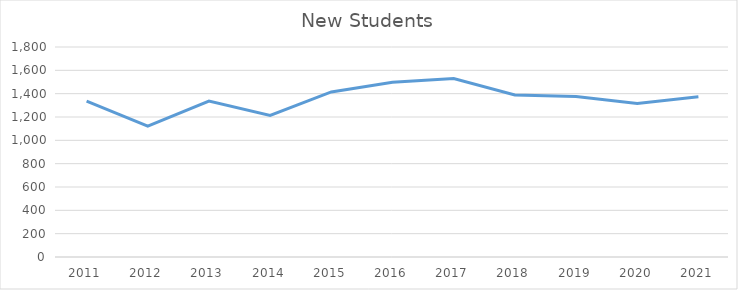
| Category | New Students |
|---|---|
| 2011.0 | 1336 |
| 2012.0 | 1122 |
| 2013.0 | 1336 |
| 2014.0 | 1214 |
| 2015.0 | 1415 |
| 2016.0 | 1498 |
| 2017.0 | 1530 |
| 2018.0 | 1389 |
| 2019.0 | 1376 |
| 2020.0 | 1315 |
| 2021.0 | 1373 |